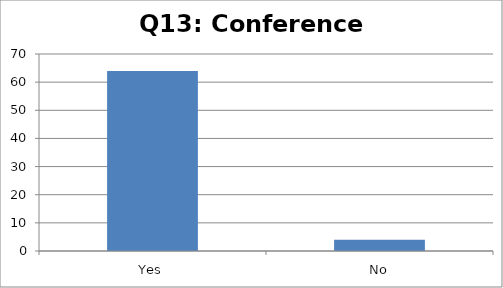
| Category | Response count |
|---|---|
| Yes | 64 |
| No | 4 |